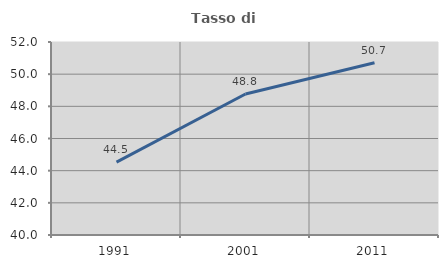
| Category | Tasso di occupazione   |
|---|---|
| 1991.0 | 44.535 |
| 2001.0 | 48.77 |
| 2011.0 | 50.709 |